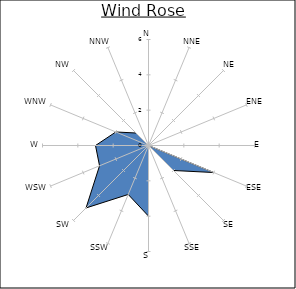
| Category | Series 0 |
|---|---|
| N | 0 |
| NNE | 0 |
| NE | 0 |
| ENE | 0 |
| E | 0 |
| ESE | 4 |
| SE | 2 |
| SSE | 0 |
| S | 4 |
| SSW | 3 |
| SW | 5 |
| WSW | 3 |
| W | 3 |
| WNW | 2 |
| NW | 1 |
| NNW | 0 |